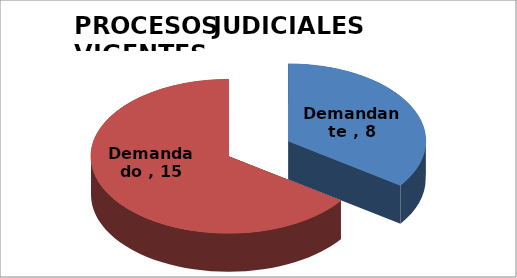
| Category | Series 0 |
|---|---|
| Demandante  | 8 |
| Demandado  | 15 |